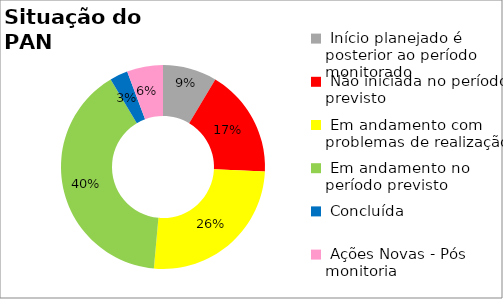
| Category | Series 0 |
|---|---|
|  Início planejado é posterior ao período monitorado | 0.086 |
|  Não iniciada no período previsto | 0.171 |
|  Em andamento com problemas de realização | 0.257 |
|  Em andamento no período previsto  | 0.4 |
|  Concluída | 0.029 |
|  Ações Novas - Pós monitoria | 0.057 |